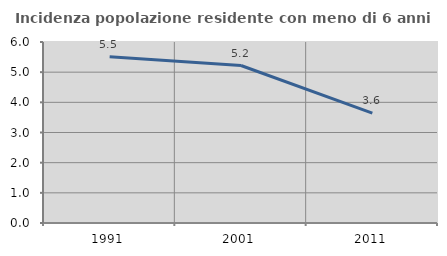
| Category | Incidenza popolazione residente con meno di 6 anni |
|---|---|
| 1991.0 | 5.511 |
| 2001.0 | 5.221 |
| 2011.0 | 3.641 |